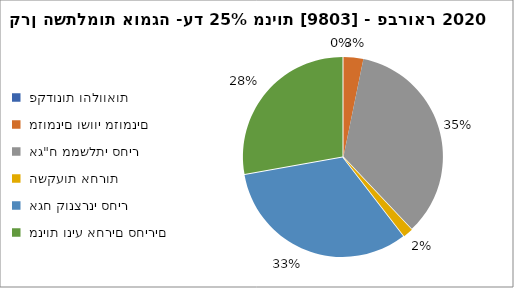
| Category | קרן השתלמות אומגה -עד 25% מניות [9803] - פברואר 2020 |
|---|---|
|  פקדונות והלוואות  | 0 |
|  מזומנים ושווי מזומנים   | 434 |
|  אג"ח ממשלתי סחיר  | 4702 |
|  השקעות אחרות  | 218 |
|  אגח קונצרני סחיר  | 4418 |
|  מניות וניע אחרים סחירים   | 3762 |